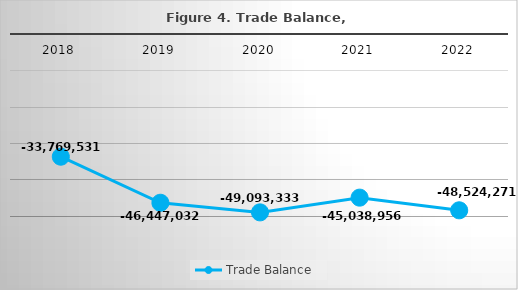
| Category | Trade Balance |
|---|---|
| 2018.0 | -33769530.642 |
| 2019.0 | -46447031.78 |
| 2020.0 | -49093333.29 |
| 2021.0 | -45038955.82 |
| 2022.0 | -48524271.357 |